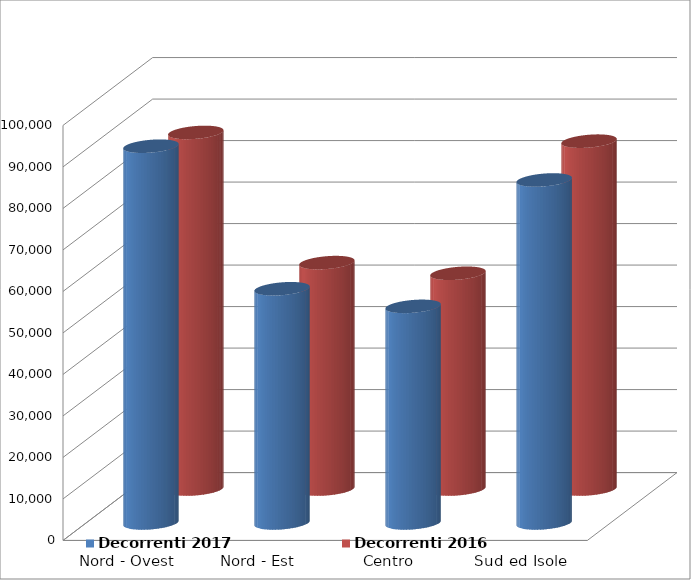
| Category | Decorrenti 2017 | Decorrenti 2016 |
|---|---|---|
| Nord - Ovest | 90784 | 85924 |
| Nord - Est | 56435 | 54557 |
| Centro | 52190 | 51989 |
| Sud ed Isole | 82645 | 83822 |